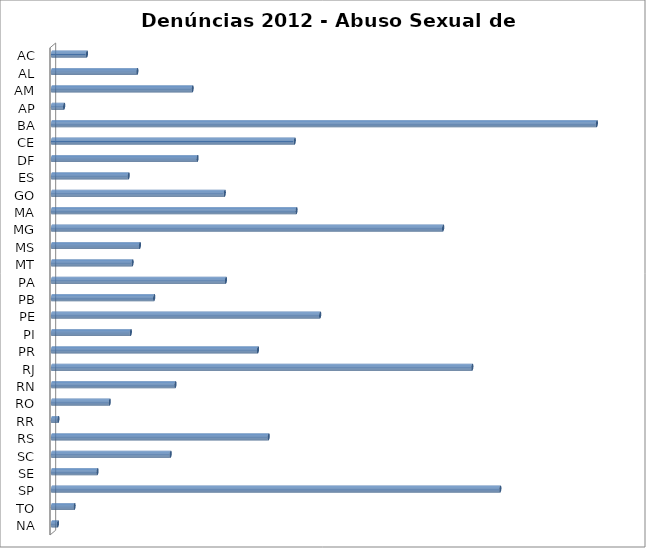
| Category | Series 0 |
|---|---|
| AC | 242 |
| AL | 591 |
| AM | 974 |
| AP | 84 |
| BA | 3775 |
| CE | 1682 |
| DF | 1008 |
| ES | 531 |
| GO | 1197 |
| MA | 1694 |
| MG | 2710 |
| MS | 609 |
| MT | 558 |
| PA | 1205 |
| PB | 708 |
| PE | 1858 |
| PI | 546 |
| PR | 1427 |
| RJ | 2912 |
| RN | 855 |
| RO | 400 |
| RR | 44 |
| RS | 1501 |
| SC | 822 |
| SE | 315 |
| SP | 3106 |
| TO | 156 |
| NA | 41 |